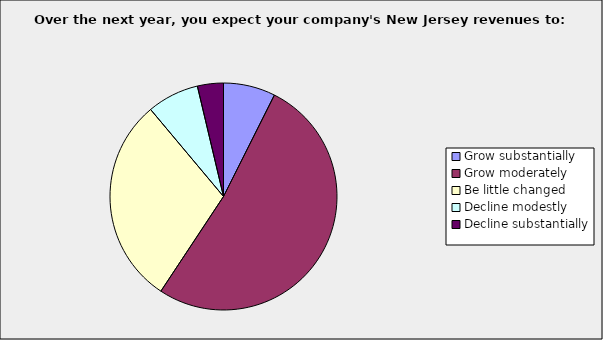
| Category | Series 0 |
|---|---|
| Grow substantially | 0.074 |
| Grow moderately | 0.519 |
| Be little changed | 0.296 |
| Decline modestly | 0.074 |
| Decline substantially | 0.037 |